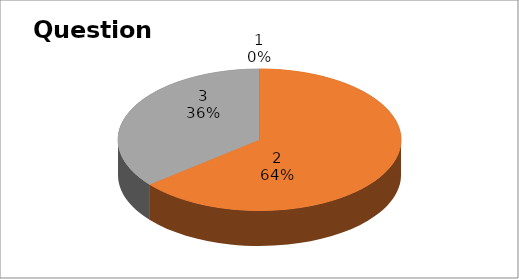
| Category | Series 0 |
|---|---|
| 0 | 0 |
| 1 | 25 |
| 2 | 14 |